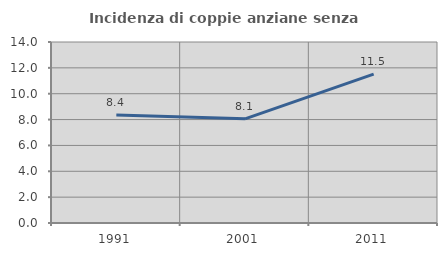
| Category | Incidenza di coppie anziane senza figli  |
|---|---|
| 1991.0 | 8.358 |
| 2001.0 | 8.056 |
| 2011.0 | 11.509 |